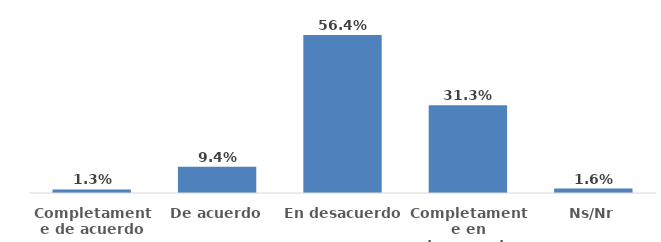
| Category | Series 0 |
|---|---|
| Completamente de acuerdo | 0.013 |
| De acuerdo | 0.094 |
| En desacuerdo | 0.564 |
| Completamente en desacuerdo | 0.313 |
| Ns/Nr | 0.016 |